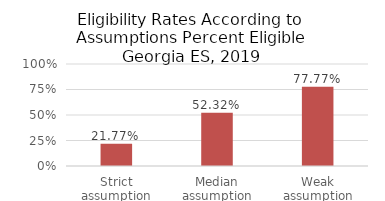
| Category | Series 0 |
|---|---|
| Strict assumption | 0.218 |
| Median assumption | 0.523 |
| Weak assumption | 0.778 |